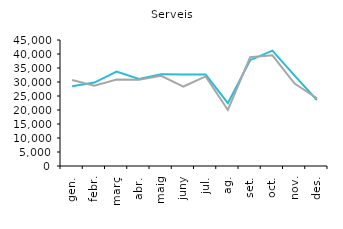
| Category | 2018 | 2019 |
|---|---|---|
| gen. | 28478 | 30742 |
| febr. | 29787 | 28650 |
| març | 33746 | 30906 |
| abr. | 31063 | 30848 |
| maig | 32808 | 32230 |
| juny | 32716 | 28383 |
| jul. | 32660 | 31981 |
| ag. | 22416 | 20004 |
| set. | 37797 | 38825 |
| oct. | 41206 | 39548 |
| nov. | 32278 | 29435 |
| des. | 23578 | 24188 |